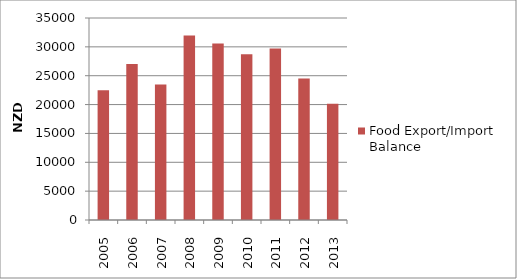
| Category | Food Export/Import Balance |
|---|---|
| 2005.0 | 22500 |
| 2006.0 | 27042 |
| 2007.0 | 23488 |
| 2008.0 | 31980 |
| 2009.0 | 30586 |
| 2010.0 | 28738 |
| 2011.0 | 29702 |
| 2012.0 | 24496 |
| 2013.0 | 20155 |